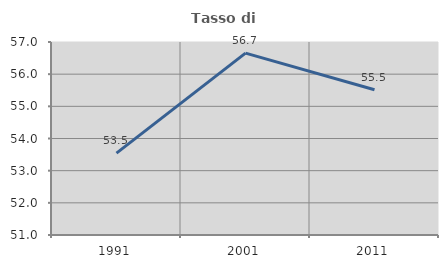
| Category | Tasso di occupazione   |
|---|---|
| 1991.0 | 53.546 |
| 2001.0 | 56.653 |
| 2011.0 | 55.517 |